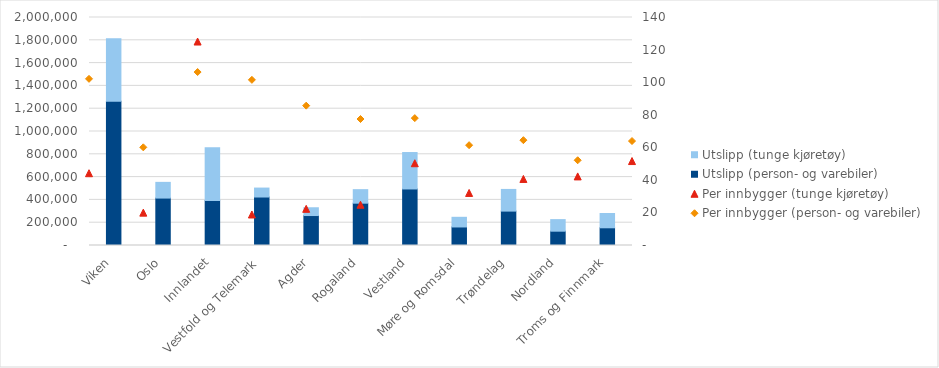
| Category | Utslipp (person- og varebiler) | Utslipp (tunge kjøretøy) |
|---|---|---|
| Viken | 1266396.884 | 547088.134 |
| Oslo | 415973.27 | 137822.966 |
| Innlandet | 394412.013 | 463978.285 |
| Vestfold og Telemark | 425305.657 | 78546.129 |
| Agder | 262845.499 | 68261.954 |
| Rogaland | 371260.989 | 118678.604 |
| Vestland | 495933.156 | 319595.153 |
| Møre og Romsdal | 162572.161 | 84771.61 |
| Trøndelag | 301734.347 | 190107.59 |
| Nordland | 125533.145 | 101587.925 |
| Troms og Finnmark | 155341.652 | 125413.919 |